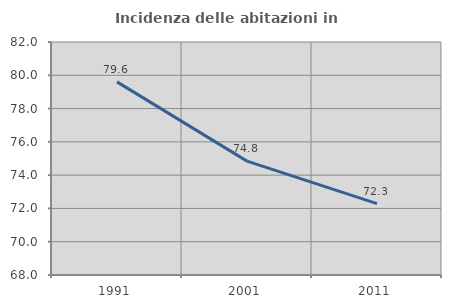
| Category | Incidenza delle abitazioni in proprietà  |
|---|---|
| 1991.0 | 79.605 |
| 2001.0 | 74.843 |
| 2011.0 | 72.289 |